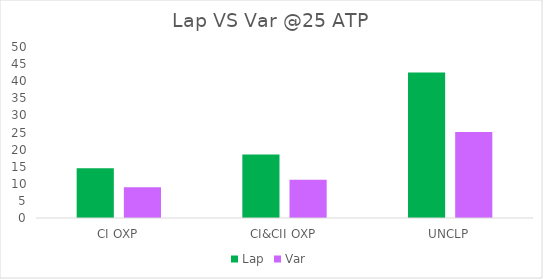
| Category | Lap | Var |
|---|---|---|
| CI OXP | 14.549 | 8.992 |
| CI&CII OXP | 18.559 | 11.192 |
| UNCLP | 42.536 | 25.122 |